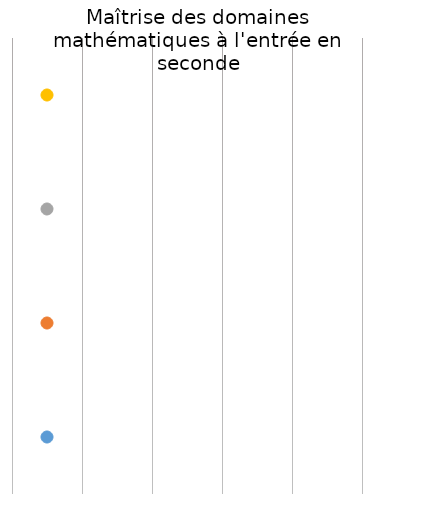
| Category | Series 0 |
|---|---|
| 1.0 | 1 |
| 1.0 | 2 |
| 1.0 | 3 |
| 1.0 | 4 |